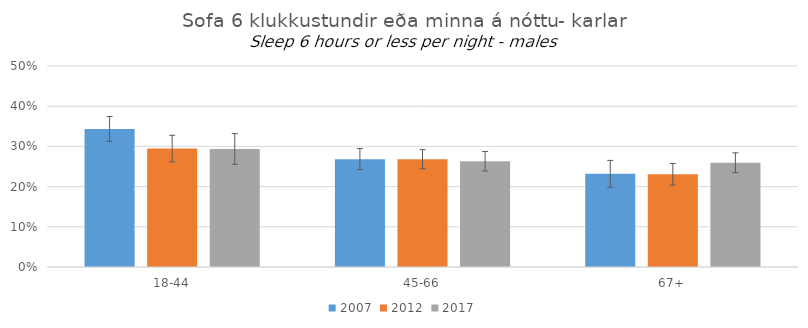
| Category | 2007 | 2012 | 2017 |
|---|---|---|---|
| 18-44 | 0.343 | 0.295 | 0.294 |
| 45-66 | 0.268 | 0.268 | 0.263 |
| 67+ | 0.232 | 0.231 | 0.259 |